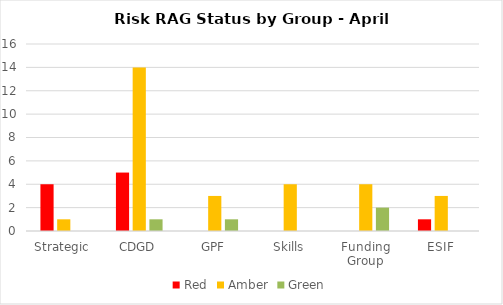
| Category | Red | Amber | Green |
|---|---|---|---|
| Strategic | 4 | 1 | 0 |
| CDGD | 5 | 14 | 1 |
| GPF | 0 | 3 | 1 |
| Skills | 0 | 4 | 0 |
| Funding Group | 0 | 4 | 2 |
| ESIF | 1 | 3 | 0 |